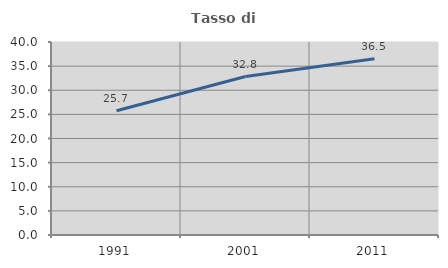
| Category | Tasso di occupazione   |
|---|---|
| 1991.0 | 25.746 |
| 2001.0 | 32.845 |
| 2011.0 | 36.514 |